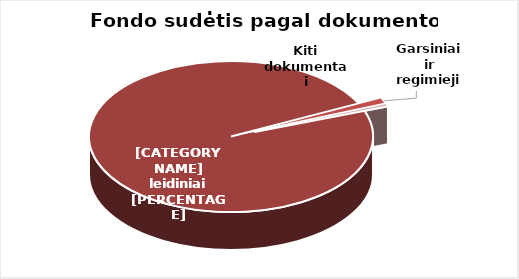
| Category | Series 0 |
|---|---|
| Knygos ir serialiniai | 1090086 |
| Garsiniai ir regimieji | 13206 |
| Kiti dokumentai | 5277 |